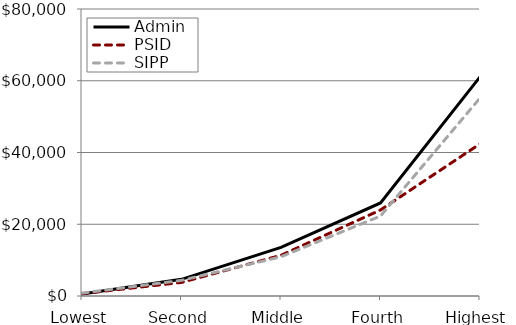
| Category | Admin | PSID | SIPP |
|---|---|---|---|
| Lowest | 535.245 | 650.717 | 796.186 |
| Second | 4648.209 | 3784.957 | 4356.7 |
| Middle | 13565.376 | 11346.02 | 10938.64 |
| Fourth | 25931.397 | 23980.08 | 22288.62 |
| Highest | 61088.561 | 42408.18 | 55185.91 |